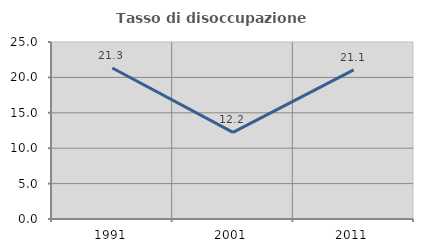
| Category | Tasso di disoccupazione giovanile  |
|---|---|
| 1991.0 | 21.333 |
| 2001.0 | 12.23 |
| 2011.0 | 21.053 |